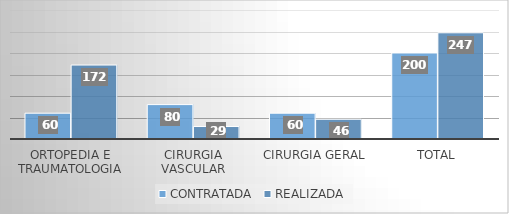
| Category | CONTRATADA | REALIZADA |
|---|---|---|
| Ortopedia e traumatologia | 60 | 172 |
| Cirurgia vascular | 80 | 29 |
| Cirurgia Geral | 60 | 46 |
| TOTAL | 200 | 247 |